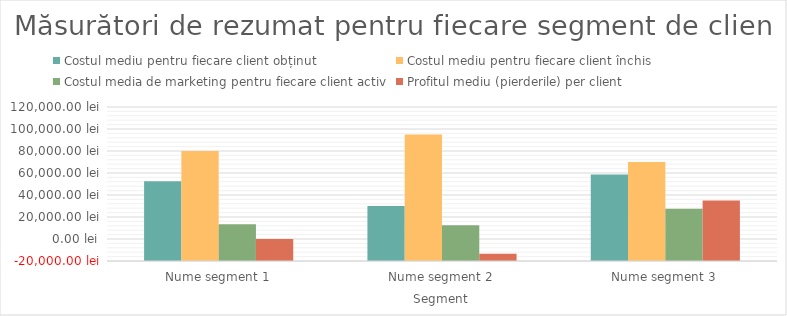
| Category | Costul mediu pentru fiecare client obținut | Costul mediu pentru fiecare client închis | Costul media de marketing pentru fiecare client activ | Profitul mediu (pierderile) per client |
|---|---|---|---|---|
| Nume segment 1 | 52500 | 80000 | 13333.333 | 0 |
| Nume segment 2 | 30000 | 95000 | 12500 | -13500 |
| Nume segment 3 | 58750 | 70000 | 27500 | 35000 |